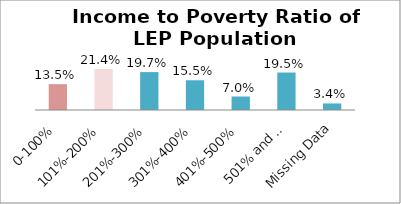
| Category | Percent |
|---|---|
| 0-100% | 0.135 |
| 101%-200% | 0.214 |
| 201%-300% | 0.197 |
| 301%-400% | 0.155 |
| 401%-500% | 0.07 |
| 501% and Over | 0.195 |
| Missing Data | 0.034 |